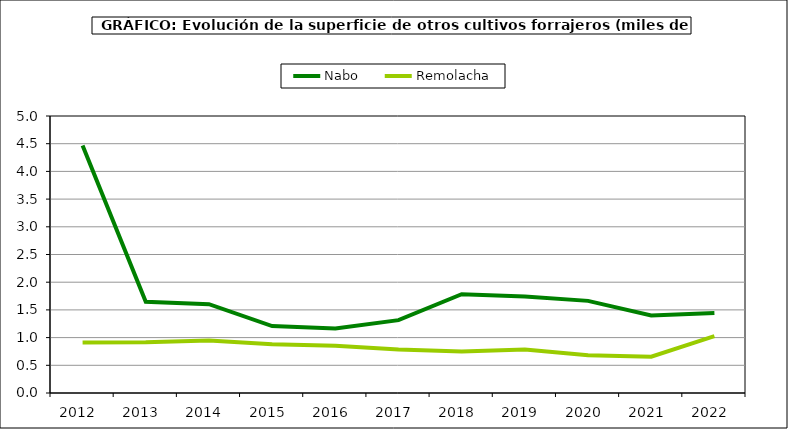
| Category | Nabo | Remolacha |
|---|---|---|
| 2012.0 | 4.467 | 0.913 |
| 2013.0 | 1.647 | 0.917 |
| 2014.0 | 1.603 | 0.949 |
| 2015.0 | 1.208 | 0.881 |
| 2016.0 | 1.165 | 0.854 |
| 2017.0 | 1.315 | 0.786 |
| 2018.0 | 1.784 | 0.748 |
| 2019.0 | 1.744 | 0.787 |
| 2020.0 | 1.663 | 0.681 |
| 2021.0 | 1.398 | 0.655 |
| 2022.0 | 1.442 | 1.026 |